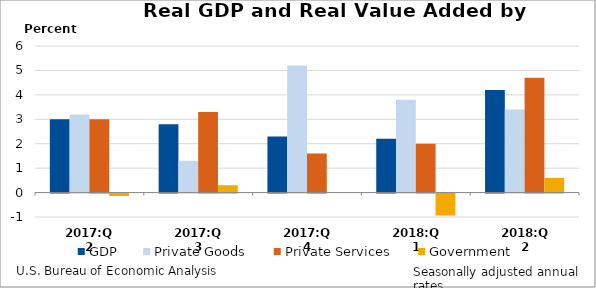
| Category | GDP | Private Goods | Private Services | Government |
|---|---|---|---|---|
| 2017:Q2 | 3 | 3.2 | 3 | -0.1 |
| 2017:Q3 | 2.8 | 1.3 | 3.3 | 0.3 |
| 2017:Q4 | 2.3 | 5.2 | 1.6 | 0 |
| 2018:Q1 | 2.2 | 3.8 | 2 | -0.9 |
| 2018:Q2 | 4.2 | 3.4 | 4.7 | 0.6 |